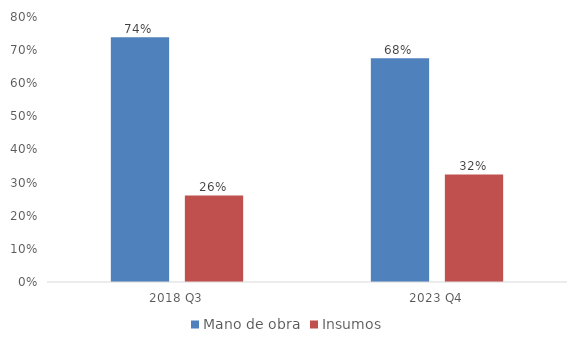
| Category | Mano de obra | Insumos |
|---|---|---|
| 2018 Q3 | 0.739 | 0.261 |
| 2023 Q4 | 0.675 | 0.325 |